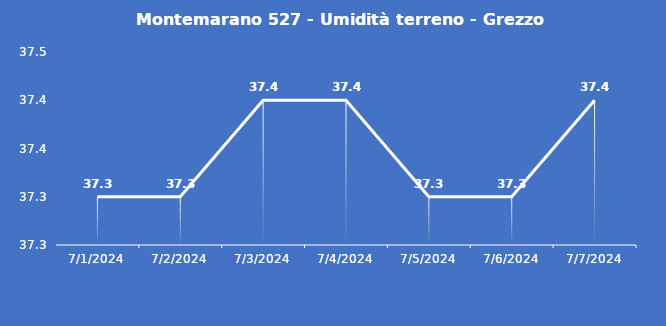
| Category | Montemarano 527 - Umidità terreno - Grezzo (%VWC) |
|---|---|
| 7/1/24 | 37.3 |
| 7/2/24 | 37.3 |
| 7/3/24 | 37.4 |
| 7/4/24 | 37.4 |
| 7/5/24 | 37.3 |
| 7/6/24 | 37.3 |
| 7/7/24 | 37.4 |